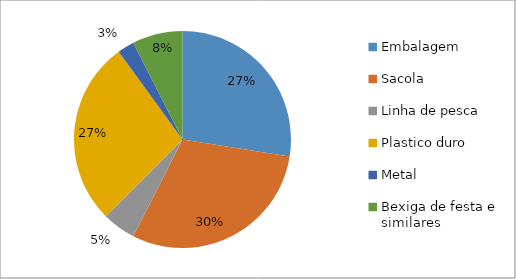
| Category | Número de Indivíduos |
|---|---|
| Embalagem  | 11 |
| Sacola | 12 |
| Linha de pesca | 2 |
| Plastico duro | 11 |
| Metal | 1 |
| Bexiga de festa e similares | 3 |